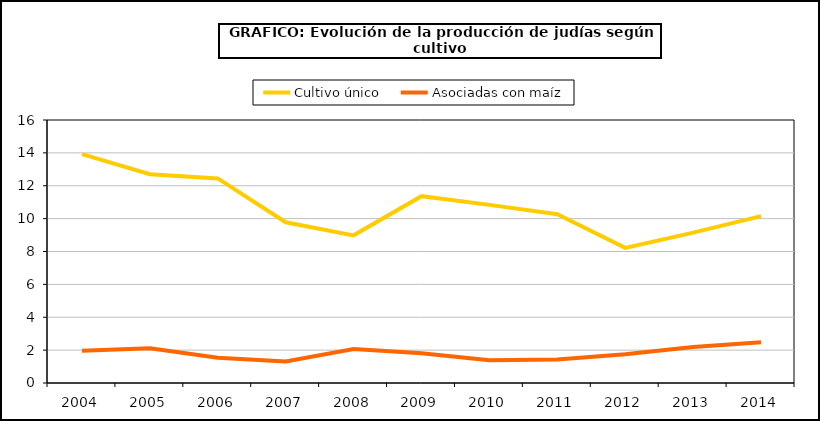
| Category | Cultivo único | Asociadas con maíz |
|---|---|---|
| 2004.0 | 13.928 | 1.96 |
| 2005.0 | 12.704 | 2.111 |
| 2006.0 | 12.447 | 1.536 |
| 2007.0 | 9.779 | 1.306 |
| 2008.0 | 8.983 | 2.065 |
| 2009.0 | 11.367 | 1.808 |
| 2010.0 | 10.837 | 1.389 |
| 2011.0 | 10.269 | 1.432 |
| 2012.0 | 8.22 | 1.751 |
| 2013.0 | 9.15 | 2.187 |
| 2014.0 | 10.155 | 2.474 |